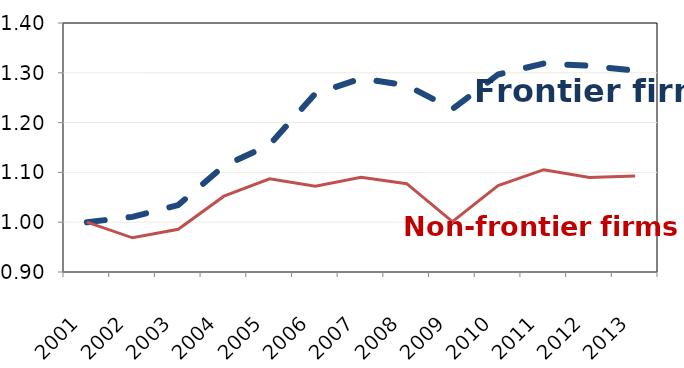
| Category | Average | Non-frontier |
|---|---|---|
| 2001.0 | 1 | 1 |
| 2002.0 | 1.011 | 0.969 |
| 2003.0 | 1.034 | 0.986 |
| 2004.0 | 1.113 | 1.052 |
| 2005.0 | 1.156 | 1.087 |
| 2006.0 | 1.258 | 1.072 |
| 2007.0 | 1.288 | 1.09 |
| 2008.0 | 1.275 | 1.077 |
| 2009.0 | 1.227 | 1.001 |
| 2010.0 | 1.297 | 1.074 |
| 2011.0 | 1.319 | 1.105 |
| 2012.0 | 1.314 | 1.09 |
| 2013.0 | 1.304 | 1.093 |